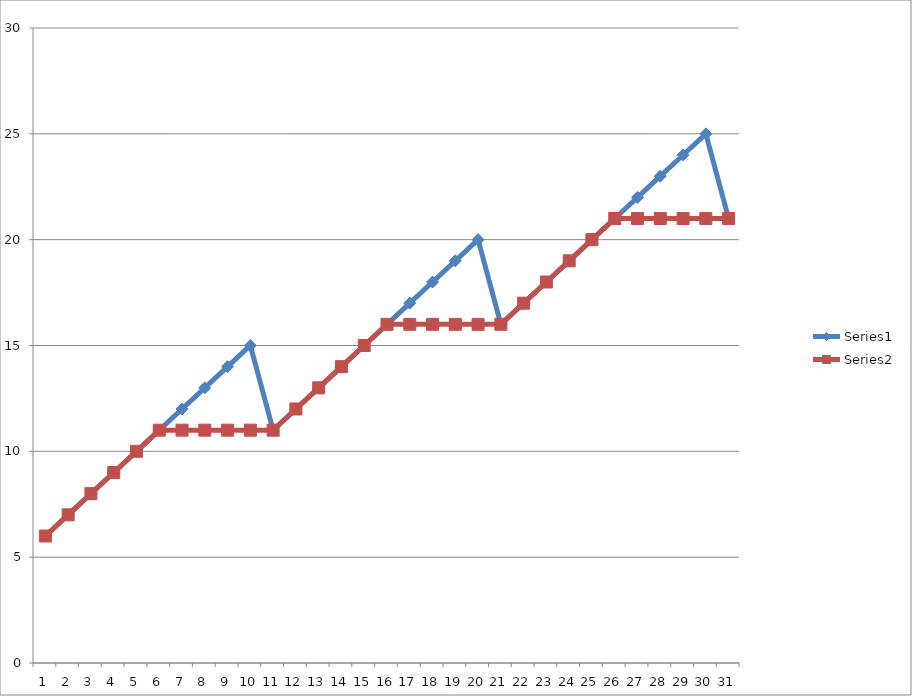
| Category | Series 0 | Series 1 |
|---|---|---|
| 0 | 6 | 6 |
| 1 | 7 | 7 |
| 2 | 8 | 8 |
| 3 | 9 | 9 |
| 4 | 10 | 10 |
| 5 | 11 | 11 |
| 6 | 12 | 11 |
| 7 | 13 | 11 |
| 8 | 14 | 11 |
| 9 | 15 | 11 |
| 10 | 11 | 11 |
| 11 | 12 | 12 |
| 12 | 13 | 13 |
| 13 | 14 | 14 |
| 14 | 15 | 15 |
| 15 | 16 | 16 |
| 16 | 17 | 16 |
| 17 | 18 | 16 |
| 18 | 19 | 16 |
| 19 | 20 | 16 |
| 20 | 16 | 16 |
| 21 | 17 | 17 |
| 22 | 18 | 18 |
| 23 | 19 | 19 |
| 24 | 20 | 20 |
| 25 | 21 | 21 |
| 26 | 22 | 21 |
| 27 | 23 | 21 |
| 28 | 24 | 21 |
| 29 | 25 | 21 |
| 30 | 21 | 21 |